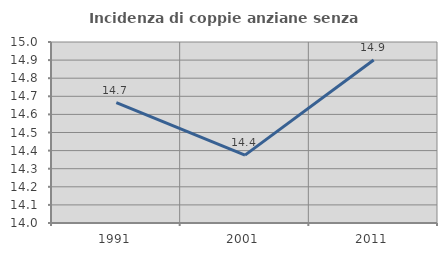
| Category | Incidenza di coppie anziane senza figli  |
|---|---|
| 1991.0 | 14.665 |
| 2001.0 | 14.375 |
| 2011.0 | 14.901 |